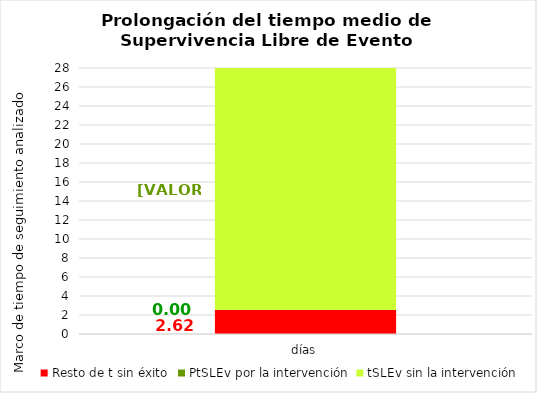
| Category | Resto de t sin éxito | PtSLEv por la intervención | tSLEv sin la intervención |
|---|---|---|---|
| días | 2.624 | 0 | 25.376 |